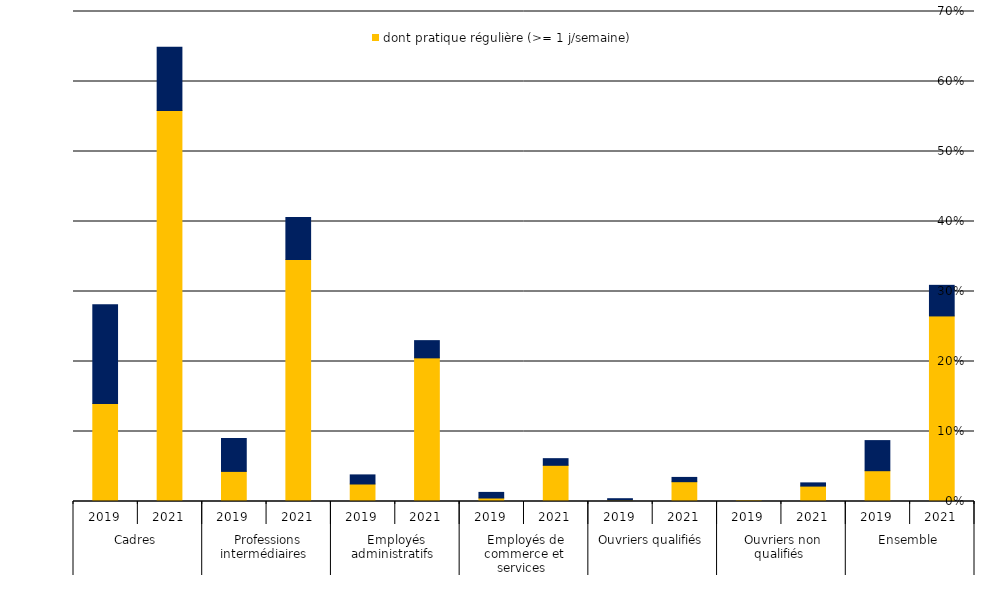
| Category | dont pratique régulière (>= 1 j/semaine) | ecart |
|---|---|---|
| 0 | 0.14 | 0.141 |
| 1 | 0.558 | 0.09 |
| 2 | 0.043 | 0.047 |
| 3 | 0.346 | 0.06 |
| 4 | 0.025 | 0.013 |
| 5 | 0.205 | 0.025 |
| 6 | 0.005 | 0.008 |
| 7 | 0.052 | 0.009 |
| 8 | 0.002 | 0.002 |
| 9 | 0.028 | 0.006 |
| 10 | 0.001 | 0 |
| 11 | 0.022 | 0.005 |
| 12 | 0.044 | 0.043 |
| 13 | 0.265 | 0.044 |